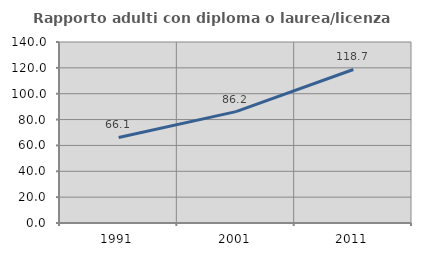
| Category | Rapporto adulti con diploma o laurea/licenza media  |
|---|---|
| 1991.0 | 66.15 |
| 2001.0 | 86.168 |
| 2011.0 | 118.738 |